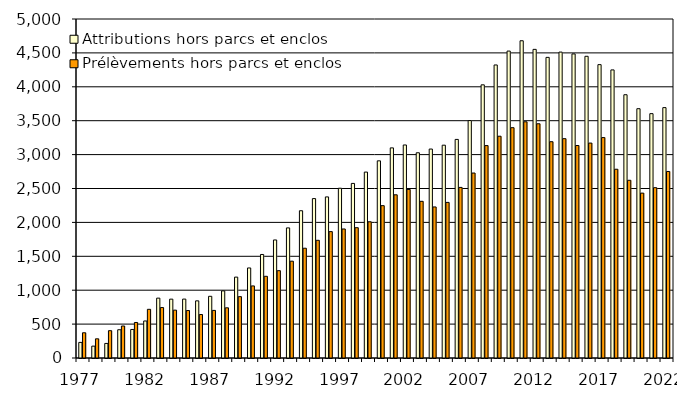
| Category | Attributions hors parcs et enclos | Prélèvements hors parcs et enclos |
|---|---|---|
| 1977.0 | 230 | 372 |
| 1978.0 | 175 | 283 |
| 1979.0 | 215 | 403 |
| 1980.0 | 417 | 472 |
| 1981.0 | 421 | 524 |
| 1982.0 | 546 | 718 |
| 1983.0 | 883 | 744 |
| 1984.0 | 868 | 706 |
| 1985.0 | 869 | 700 |
| 1986.0 | 843 | 641 |
| 1987.0 | 910 | 702 |
| 1988.0 | 990 | 740 |
| 1989.0 | 1193 | 905 |
| 1990.0 | 1328 | 1063 |
| 1991.0 | 1527 | 1205 |
| 1992.0 | 1741 | 1288 |
| 1993.0 | 1919 | 1428 |
| 1994.0 | 2172 | 1619 |
| 1995.0 | 2351 | 1736 |
| 1996.0 | 2376 | 1864 |
| 1997.0 | 2504 | 1903 |
| 1998.0 | 2575 | 1922 |
| 1999.0 | 2742 | 2009 |
| 2000.0 | 2908 | 2247 |
| 2001.0 | 3099 | 2407 |
| 2002.0 | 3142 | 2486 |
| 2003.0 | 3027 | 2311 |
| 2004.0 | 3082 | 2228 |
| 2005.0 | 3139 | 2295 |
| 2006.0 | 3224 | 2516 |
| 2007.0 | 3502 | 2728 |
| 2008.0 | 4029 | 3133 |
| 2009.0 | 4322 | 3271 |
| 2010.0 | 4527 | 3397 |
| 2011.0 | 4679 | 3484 |
| 2012.0 | 4552 | 3455 |
| 2013.0 | 4434 | 3190 |
| 2014.0 | 4512 | 3235 |
| 2015.0 | 4485 | 3134 |
| 2016.0 | 4450 | 3170 |
| 2017.0 | 4327 | 3251 |
| 2018.0 | 4249 | 2784 |
| 2019.0 | 3883 | 2621 |
| 2020.0 | 3677 | 2432 |
| 2021.0 | 3604 | 2512 |
| 2022.0 | 3693 | 2751 |